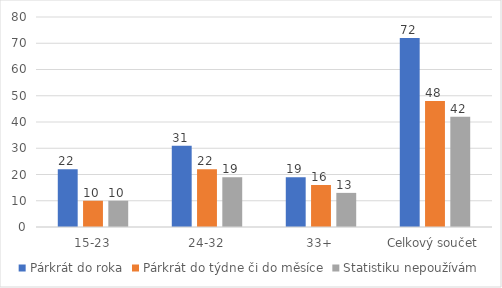
| Category | Párkrát do roka | Párkrát do týdne či do měsíce | Statistiku nepoužívám |
|---|---|---|---|
| 15-23 | 22 | 10 | 10 |
| 24-32 | 31 | 22 | 19 |
| 33+ | 19 | 16 | 13 |
| Celkový součet | 72 | 48 | 42 |